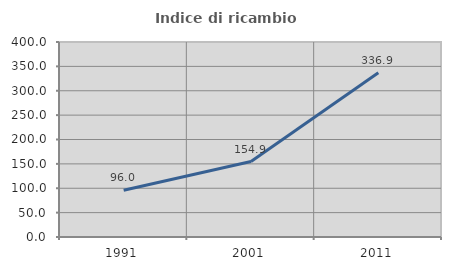
| Category | Indice di ricambio occupazionale  |
|---|---|
| 1991.0 | 95.985 |
| 2001.0 | 154.867 |
| 2011.0 | 336.86 |